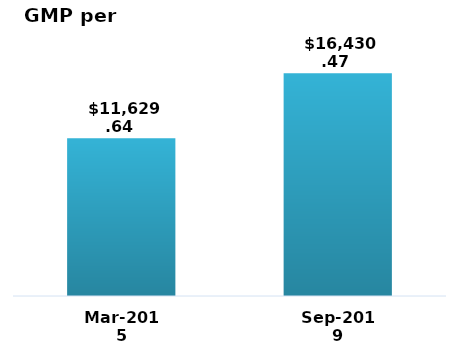
| Category | Graph |
|---|---|
| Mar-2015 | 11629.635 |
| Sep-2019 | 16430.474 |